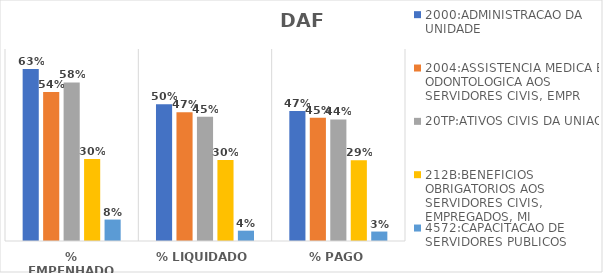
| Category | 2000:ADMINISTRACAO DA UNIDADE | 2004:ASSISTENCIA MEDICA E ODONTOLOGICA AOS SERVIDORES CIVIS, EMPR | 20TP:ATIVOS CIVIS DA UNIAO | 212B:BENEFICIOS OBRIGATORIOS AOS SERVIDORES CIVIS, EMPREGADOS, MI | 4572:CAPACITACAO DE SERVIDORES PUBLICOS FEDERAIS EM PROCESSO DE Q |
|---|---|---|---|---|---|
| % EMPENHADO | 0.627 | 0.544 | 0.578 | 0.299 | 0.078 |
| % LIQUIDADO | 0.499 | 0.469 | 0.453 | 0.295 | 0.038 |
| % PAGO | 0.474 | 0.449 | 0.443 | 0.295 | 0.034 |